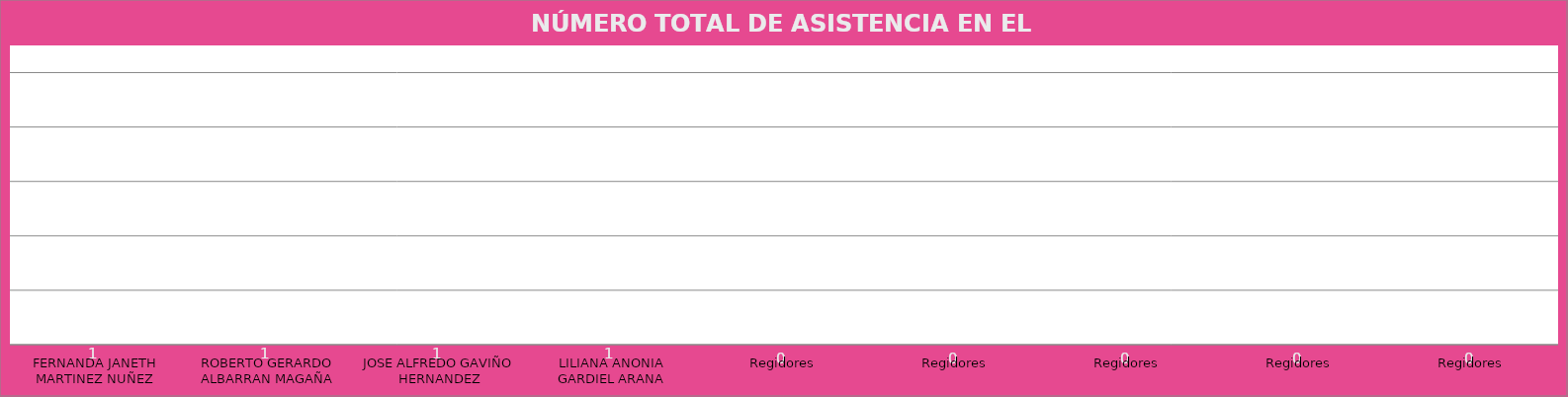
| Category | FERNANDA JANETH MARTINEZ NUÑEZ |
|---|---|
| FERNANDA JANETH MARTINEZ NUÑEZ | 1 |
| ROBERTO GERARDO ALBARRAN MAGAÑA | 1 |
| JOSE ALFREDO GAVIÑO HERNANDEZ | 1 |
| LILIANA ANONIA GARDIEL ARANA | 1 |
| Regidores | 0 |
| Regidores | 0 |
| Regidores | 0 |
| Regidores | 0 |
| Regidores | 0 |